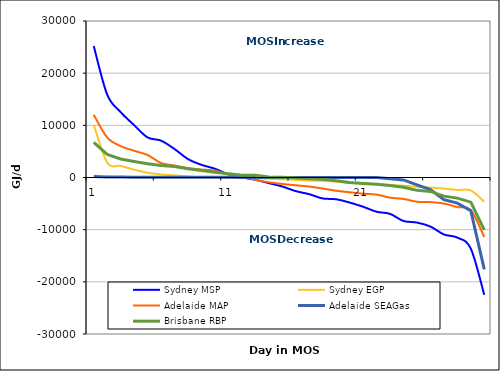
| Category | Sydney MSP | Sydney EGP | Adelaide MAP | Adelaide SEAGas | Brisbane RBP |
|---|---|---|---|---|---|
| 0 | 25212 | 10121.312 | 12028 | 196 | 6739 |
| 1 | 15882 | 2855.562 | 7677 | 94 | 4416 |
| 2 | 12537 | 2208.902 | 6013 | 80 | 3557 |
| 3 | 10038 | 1513.619 | 5133 | 61 | 3085 |
| 4 | 7678 | 909.878 | 4303 | 59 | 2654 |
| 5 | 7063 | 578.356 | 2776 | 52 | 2294 |
| 6 | 5457 | 404.612 | 2287 | 47 | 2103 |
| 7 | 3534 | 206.111 | 1805 | 41 | 1669 |
| 8 | 2428 | 28.385 | 1523 | 36 | 1342 |
| 9 | 1680 | -7.828 | 1322 | 28 | 1026 |
| 10 | 610 | -24.091 | 574 | 24 | 741 |
| 11 | 12 | -71.398 | 299 | 16 | 446 |
| 12 | -437 | -149.969 | -447 | 7 | 411 |
| 13 | -1075 | -245.637 | -917 | 4 | 102 |
| 14 | -1728 | -335.287 | -1240 | 2 | 36 |
| 15 | -2611 | -436.812 | -1488 | 0 | -94 |
| 16 | -3196 | -590.639 | -1738 | 0 | -230 |
| 17 | -4017 | -656.287 | -2116 | -1 | -330 |
| 18 | -4173 | -789.037 | -2540 | -1 | -624 |
| 19 | -4797 | -1044.879 | -2825 | -3 | -970 |
| 20 | -5600 | -1094.212 | -3105 | -3 | -1150 |
| 21 | -6562 | -1256.354 | -3280 | -5 | -1282 |
| 22 | -6970 | -1466.619 | -3865 | -243 | -1526 |
| 23 | -8338 | -1580.237 | -4111 | -472 | -1858 |
| 24 | -8638 | -1791.637 | -4647 | -1398 | -2465 |
| 25 | -9399 | -1924.434 | -4716 | -2311 | -2669 |
| 26 | -10920 | -2119.76 | -4994 | -4258 | -3571 |
| 27 | -11520 | -2391.894 | -5671 | -4906 | -3952 |
| 28 | -13635 | -2483.531 | -6268 | -6361 | -4723 |
| 29 | -22495 | -4648.846 | -11397 | -17616 | -10035 |